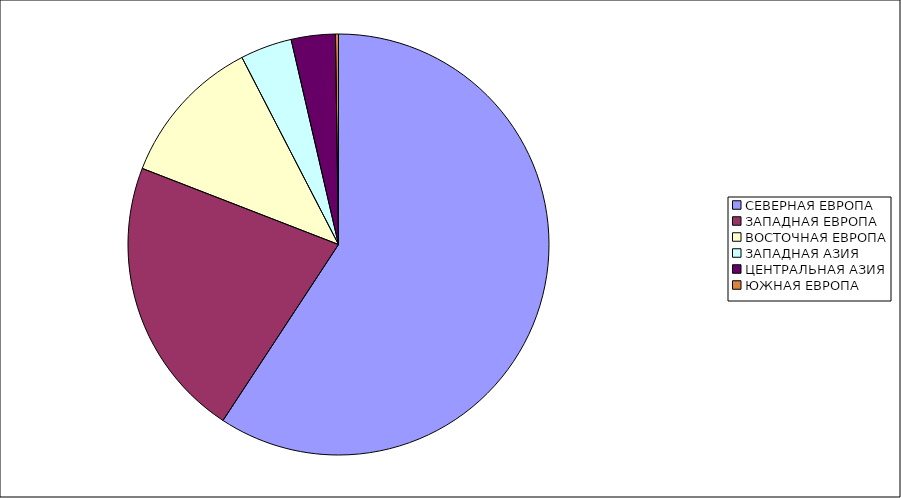
| Category | Оборот |
|---|---|
| СЕВЕРНАЯ ЕВРОПА | 59.244 |
| ЗАПАДНАЯ ЕВРОПА | 21.642 |
| ВОСТОЧНАЯ ЕВРОПА | 11.529 |
| ЗАПАДНАЯ АЗИЯ | 3.969 |
| ЦЕНТРАЛЬНАЯ АЗИЯ | 3.384 |
| ЮЖНАЯ ЕВРОПА | 0.232 |